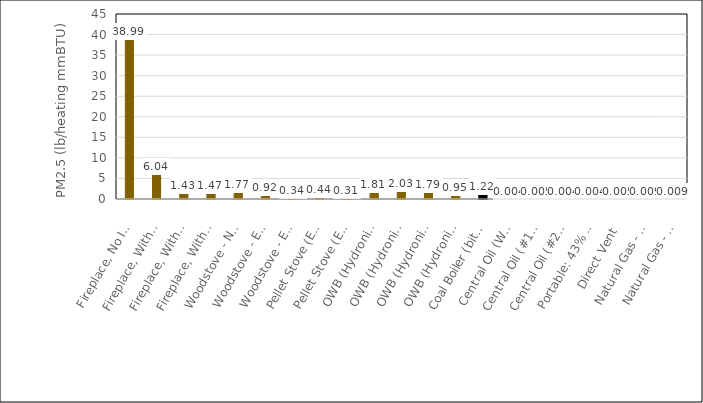
| Category | Series 0 |
|---|---|
| Fireplace, No Insert | 38.994 |
| Fireplace, With Insert - Non-EPA Certified | 6.035 |
| Fireplace, With Insert - EPA Certified Non-Catalytic | 1.434 |
| Fireplace, With Insert - EPA Certified Catalytic | 1.465 |
| Woodstove - Non-EPA Certified | 1.774 |
| Woodstove - EPA Certified Non-Catalytic | 0.919 |
| Woodstove - EPA Certified Catalytic | 0.339 |
| Pellet Stove (Exempt) | 0.436 |
| Pellet Stove (EPA Certified) | 0.313 |
| OWB (Hydronic Heater) - 80/20 Unqual/Phase 2 Wtd | 1.811 |
| OWB (Hydronic Heater) - Unqualified | 2.027 |
| OWB (Hydronic Heater) - Phase 1 | 1.786 |
| OWB (Hydronic Heater) - Phase 2 | 0.948 |
| Coal Boiler (bituminous/subbituminous, hand-fed) | 1.222 |
| Central Oil (Weighted # 1 & #2), Residential | 0.004 |
| Central Oil (#1 distillate), Residential | 0.005 |
| Central Oil (#2 distillate), Residential | 0.004 |
| Portable: 43% Kerosene & 57% Fuel Oil | 0.004 |
| Direct Vent | 0.005 |
| Natural Gas - Residential | 0.009 |
| Natural Gas - Commercial, small uncontrolled | 0.009 |